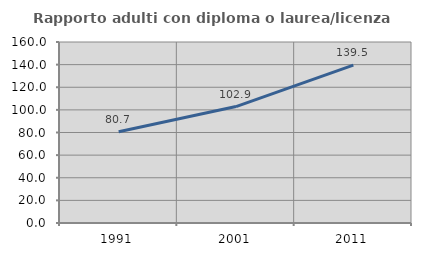
| Category | Rapporto adulti con diploma o laurea/licenza media  |
|---|---|
| 1991.0 | 80.711 |
| 2001.0 | 102.909 |
| 2011.0 | 139.544 |